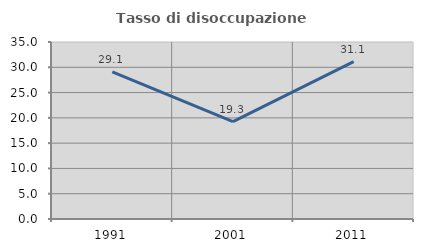
| Category | Tasso di disoccupazione giovanile  |
|---|---|
| 1991.0 | 29.114 |
| 2001.0 | 19.259 |
| 2011.0 | 31.132 |